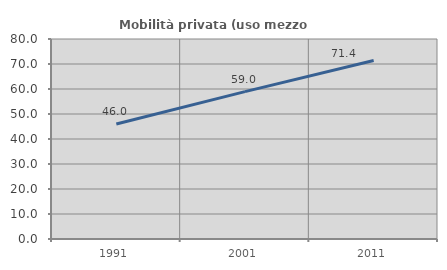
| Category | Mobilità privata (uso mezzo privato) |
|---|---|
| 1991.0 | 46.023 |
| 2001.0 | 58.962 |
| 2011.0 | 71.431 |